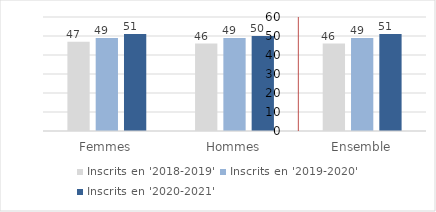
| Category | Inscrits en '2018-2019' | Inscrits en '2019-2020' | Inscrits en '2020-2021' |
|---|---|---|---|
| Femmes | 47 | 49 | 51 |
| Hommes | 46 | 49 | 50 |
| Ensemble | 46 | 49 | 51 |